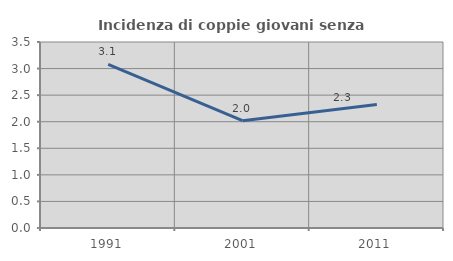
| Category | Incidenza di coppie giovani senza figli |
|---|---|
| 1991.0 | 3.077 |
| 2001.0 | 2.02 |
| 2011.0 | 2.326 |